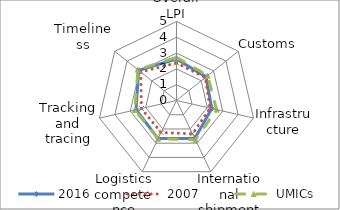
| Category | 2016 | 2007 | UMICs |
|---|---|---|---|
| Overall LPI | 2.627 | 2.38 | 2.738 |
| Customs | 2.388 | 2.33 | 2.525 |
| Infrastructure | 2.29 | 2.18 | 2.603 |
| International shipments | 2.67 | 2.34 | 2.76 |
| Logistics competence | 2.677 | 2.25 | 2.686 |
| Tracking and tracing | 2.627 | 2.28 | 2.7 |
| Timeliness | 3.062 | 2.89 | 3.125 |